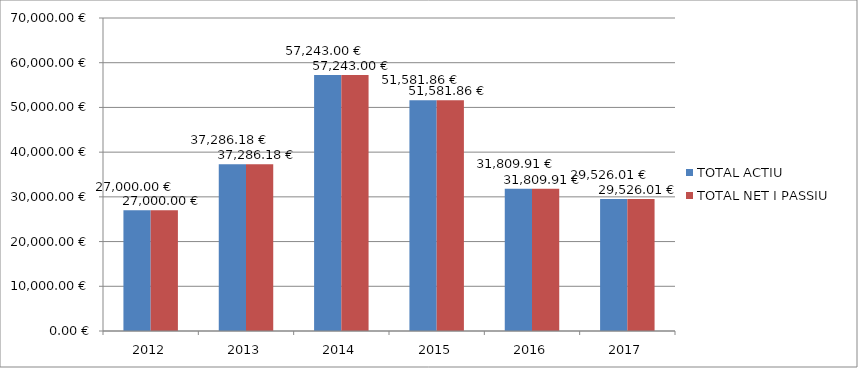
| Category | TOTAL ACTIU | TOTAL NET I PASSIU |
|---|---|---|
| 2012.0 | 27000 | 27000 |
| 2013.0 | 37286.184 | 37286.18 |
| 2014.0 | 57242.997 | 57242.997 |
| 2015.0 | 51581.86 | 51581.86 |
| 2016.0 | 31809.914 | 31809.914 |
| 2017.0 | 29526.008 | 29526.008 |